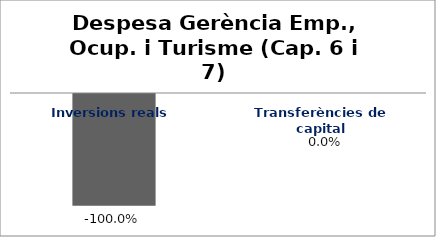
| Category | Series 0 |
|---|---|
| Inversions reals | -1 |
| Transferències de capital | 0 |